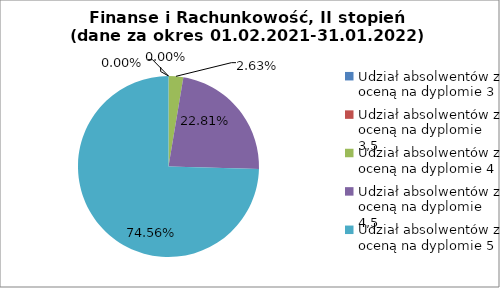
| Category | Series 0 |
|---|---|
| Udział absolwentów z oceną na dyplomie 3 | 0 |
| Udział absolwentów z oceną na dyplomie 3,5 | 0 |
| Udział absolwentów z oceną na dyplomie 4 | 2.632 |
| Udział absolwentów z oceną na dyplomie 4,5 | 22.807 |
| Udział absolwentów z oceną na dyplomie 5 | 74.561 |